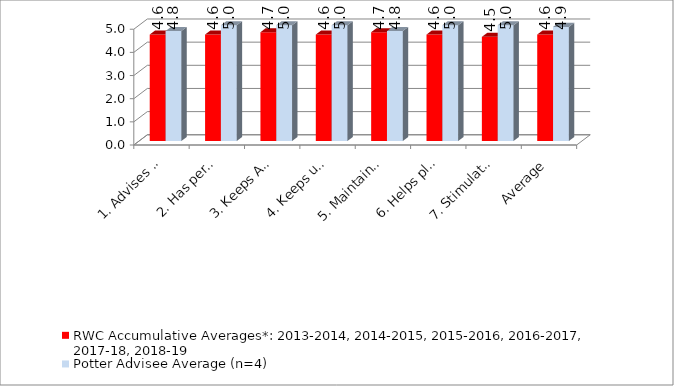
| Category | RWC Accumulative Averages*: 2013-2014, 2014-2015, 2015-2016, 2016-2017, 2017-18, 2018-19  | Potter Advisee Average (n=4) |
|---|---|---|
| 1. Advises in terms of alternatives & encourages me to assume responsibility for decisions. | 4.6 | 4.75 |
| 2. Has personal interest in assisting me through advising. | 4.6 | 5 |
| 3. Keeps Appointments when made in advance. | 4.7 | 5 |
| 4. Keeps up-to-date w/ regulations & course offerings | 4.6 | 5 |
| 5. Maintains accurate files on my progress. | 4.7 | 4.75 |
| 6. Helps plan programs consistent w/ my stated objectives. | 4.6 | 5 |
| 7. Stimulates my thinking about academic major, career choices, personal characteristics, & their relationship to each other. | 4.5 | 5 |
| Average | 4.6 | 4.929 |